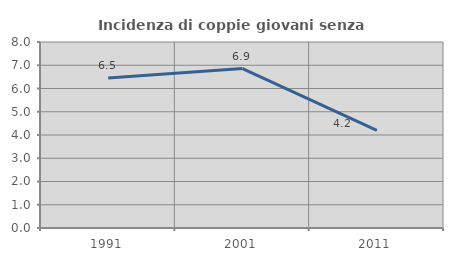
| Category | Incidenza di coppie giovani senza figli |
|---|---|
| 1991.0 | 6.452 |
| 2001.0 | 6.859 |
| 2011.0 | 4.198 |